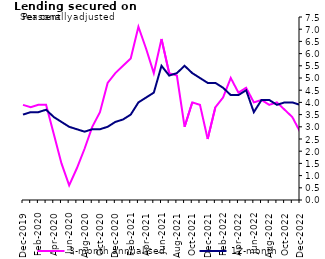
| Category | 3-month annualised | 12-month |
|---|---|---|
| Dec-2019 | 3.9 | 3.5 |
| Jan-2020 | 3.8 | 3.6 |
| Feb-2020 | 3.9 | 3.6 |
| Mar-2020 | 3.9 | 3.7 |
| Apr-2020 | 2.7 | 3.4 |
| May-2020 | 1.5 | 3.2 |
| Jun-2020 | 0.6 | 3 |
| Jul-2020 | 1.3 | 2.9 |
| Aug-2020 | 2.1 | 2.8 |
| Sep-2020 | 3 | 2.9 |
| Oct-2020 | 3.6 | 2.9 |
| Nov-2020 | 4.8 | 3 |
| Dec-2020 | 5.2 | 3.2 |
| Jan-2021 | 5.5 | 3.3 |
| Feb-2021 | 5.8 | 3.5 |
| Mar-2021 | 7.1 | 4 |
| Apr-2021 | 6.2 | 4.2 |
| May-2021 | 5.2 | 4.4 |
| Jun-2021 | 6.6 | 5.5 |
| Jul-2021 | 5.2 | 5.1 |
| Aug-2021 | 5.1 | 5.2 |
| Sep-2021 | 3 | 5.5 |
| Oct-2021 | 4 | 5.2 |
| Nov-2021 | 3.9 | 5 |
| Dec-2021 | 2.5 | 4.8 |
| Jan-2022 | 3.8 | 4.8 |
| Feb-2022 | 4.2 | 4.6 |
| Mar-2022 | 5 | 4.3 |
| Apr-2022 | 4.4 | 4.3 |
| May-2022 | 4.6 | 4.5 |
| Jun-2022 | 4 | 3.6 |
| Jul-2022 | 4.1 | 4.1 |
| Aug-2022 | 3.9 | 4.1 |
| Sep-2022 | 4 | 3.9 |
| Oct-2022 | 3.7 | 4 |
| Nov-2022 | 3.4 | 4 |
| Dec-2022 | 2.8 | 3.9 |